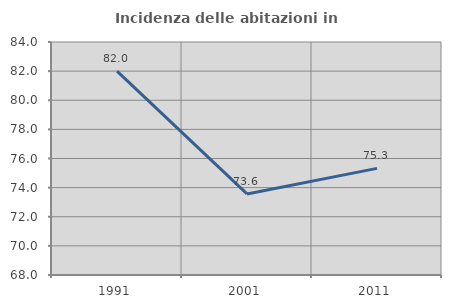
| Category | Incidenza delle abitazioni in proprietà  |
|---|---|
| 1991.0 | 82 |
| 2001.0 | 73.566 |
| 2011.0 | 75.322 |